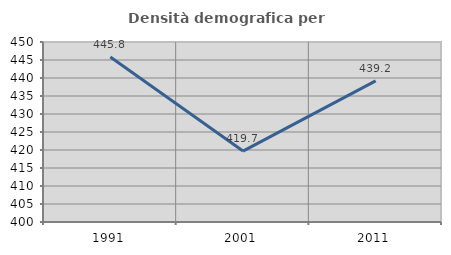
| Category | Densità demografica |
|---|---|
| 1991.0 | 445.81 |
| 2001.0 | 419.701 |
| 2011.0 | 439.218 |